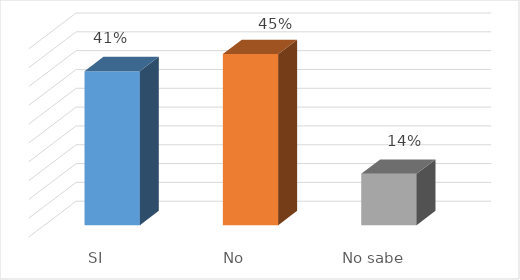
| Category | Series 0 |
|---|---|
| SI | 0.409 |
| No | 0.455 |
| No sabe | 0.136 |